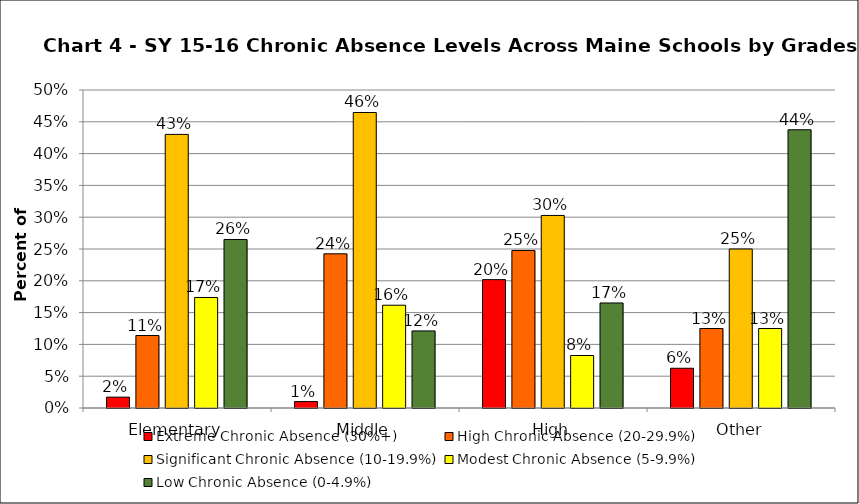
| Category | Extreme Chronic Absence (30%+) | High Chronic Absence (20-29.9%) | Significant Chronic Absence (10-19.9%) | Modest Chronic Absence (5-9.9%) | Low Chronic Absence (0-4.9%) |
|---|---|---|---|---|---|
| 0 | 0.017 | 0.114 | 0.43 | 0.174 | 0.265 |
| 1 | 0.01 | 0.242 | 0.465 | 0.162 | 0.121 |
| 2 | 0.202 | 0.248 | 0.303 | 0.083 | 0.165 |
| 3 | 0.062 | 0.125 | 0.25 | 0.125 | 0.438 |